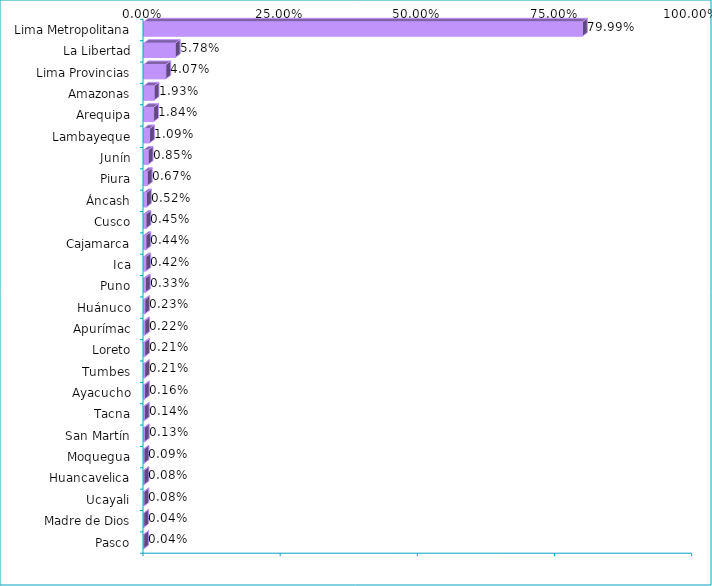
| Category | Series 0 |
|---|---|
| Lima Metropolitana | 0.8 |
| La Libertad | 0.058 |
| Lima Provincias | 0.041 |
| Amazonas | 0.019 |
| Arequipa | 0.018 |
| Lambayeque | 0.011 |
| Junín | 0.008 |
| Piura | 0.007 |
| Áncash | 0.005 |
| Cusco | 0.004 |
| Cajamarca | 0.004 |
| Ica | 0.004 |
| Puno | 0.003 |
| Huánuco | 0.002 |
| Apurímac | 0.002 |
| Loreto | 0.002 |
| Tumbes | 0.002 |
| Ayacucho | 0.002 |
| Tacna | 0.001 |
| San Martín | 0.001 |
| Moquegua | 0.001 |
| Huancavelica | 0.001 |
| Ucayali | 0.001 |
| Madre de Dios | 0 |
| Pasco | 0 |